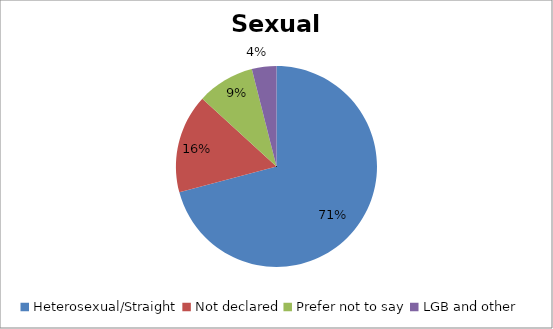
| Category | Series 1 |
|---|---|
| Heterosexual/Straight | 0.709 |
| Not declared | 0.159 |
| Prefer not to say | 0.093 |
| LGB and other | 0.04 |